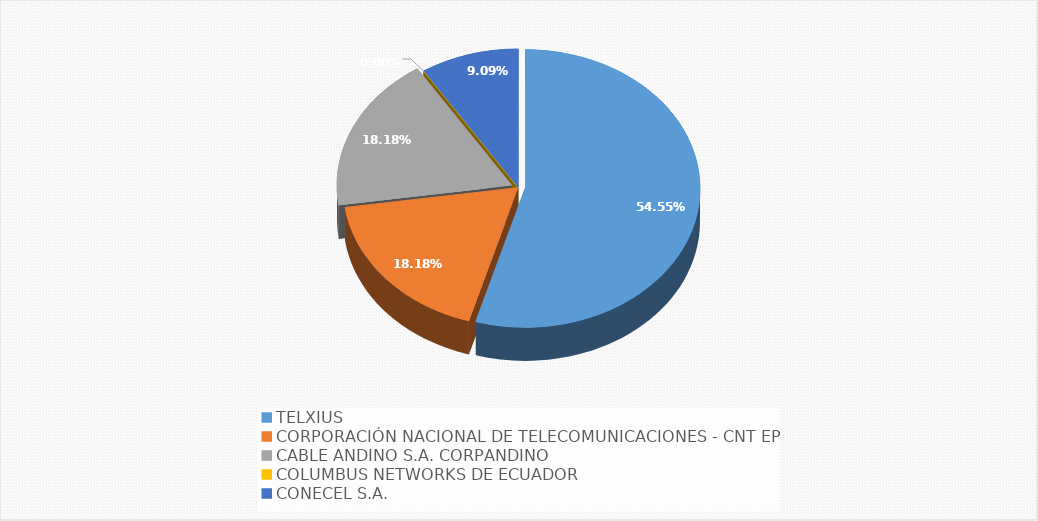
| Category | Series 0 |
|---|---|
| TELXIUS | 0.545 |
| CORPORACIÓN NACIONAL DE TELECOMUNICACIONES - CNT EP | 0.182 |
| CABLE ANDINO S.A. CORPANDINO | 0.182 |
| COLUMBUS NETWORKS DE ECUADOR | 0 |
| CONECEL S.A. | 0.091 |